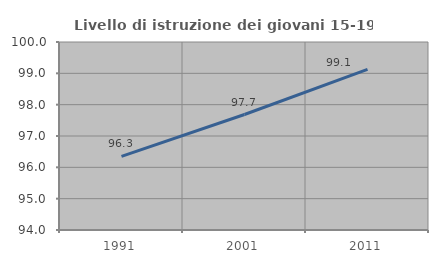
| Category | Livello di istruzione dei giovani 15-19 anni |
|---|---|
| 1991.0 | 96.349 |
| 2001.0 | 97.685 |
| 2011.0 | 99.125 |